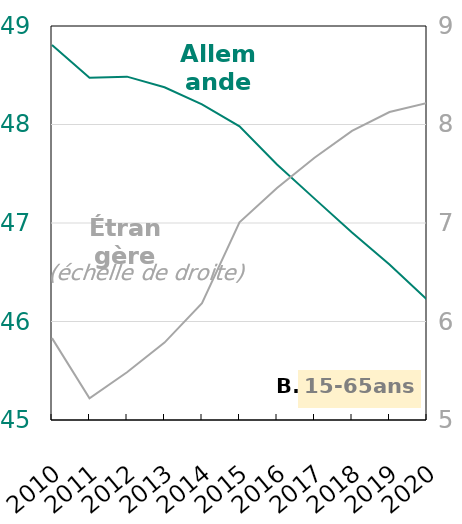
| Category | Allemande |
|---|---|
| 2010 | 48.807 |
| 2011 | 48.474 |
| 2012 | 48.486 |
| 2013 | 48.378 |
| 2014 | 48.205 |
| 2015 | 47.981 |
| 2016 | 47.594 |
| 2017 | 47.248 |
| 2018 | 46.904 |
| 2019 | 46.58 |
| 2020 | 46.223 |